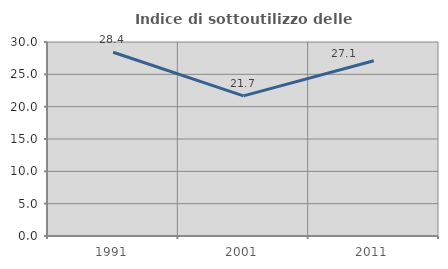
| Category | Indice di sottoutilizzo delle abitazioni  |
|---|---|
| 1991.0 | 28.418 |
| 2001.0 | 21.662 |
| 2011.0 | 27.108 |